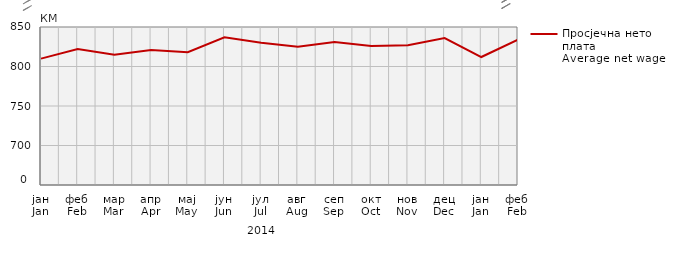
| Category | Просјечна нето плата
Average net wage |
|---|---|
| јан
Jan | 810 |
| феб
Feb | 822 |
| мар
Mar | 815 |
| апр
Apr | 821 |
| мај
May | 818 |
| јун
Jun | 837 |
| јул
Jul | 830 |
| авг
Aug | 825 |
| сеп
Sep | 831 |
| окт
Oct | 826 |
| нов
Nov | 827 |
| дец
Dec | 836 |
| јан
Jan | 812 |
| феб
Feb | 834 |